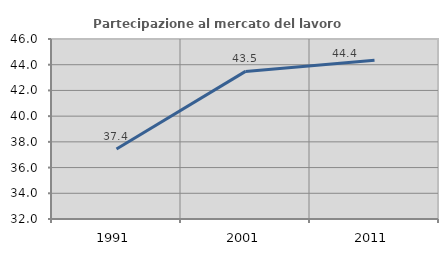
| Category | Partecipazione al mercato del lavoro  femminile |
|---|---|
| 1991.0 | 37.44 |
| 2001.0 | 43.481 |
| 2011.0 | 44.352 |